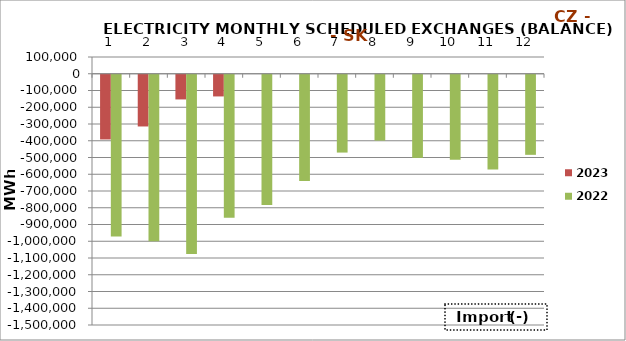
| Category | 2023 | 2022 |
|---|---|---|
| 0 | -386324.7 | -966359 |
| 1 | -308766.1 | -993646.5 |
| 2 | -147387.7 | -1069792.1 |
| 3 | -129446.5 | -854149.8 |
| 4 | 0 | -778070.6 |
| 5 | 0 | -634260.3 |
| 6 | 0 | -464594.5 |
| 7 | 0 | -393179.6 |
| 8 | 0 | -496463.8 |
| 9 | 0 | -507720.8 |
| 10 | 0 | -565897.8 |
| 11 | 0 | -478103.2 |